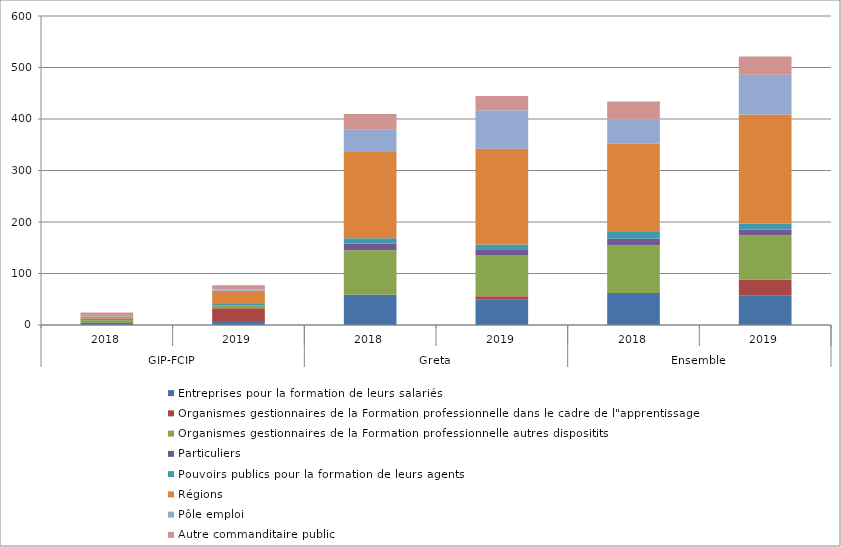
| Category | Entreprises pour la formation de leurs salariés | Organismes gestionnaires de la Formation professionnelle dans le cadre de l"apprentissage | Organismes gestionnaires de la Formation professionnelle autres dispositits | Particuliers | Pouvoirs publics pour la formation de leurs agents | Régions | Pôle emploi | Autre commanditaire public |
|---|---|---|---|---|---|---|---|---|
| 0 | 3.8 | 0 | 5.6 | 0.3 | 2.5 | 4 | 3.4 | 4.7 |
| 1 | 7.6 | 25.1 | 5.4 | 0.4 | 2.5 | 25.4 | 2.4 | 8.2 |
| 2 | 58.5 | 0 | 86.6 | 12.5 | 11 | 167.3 | 44.1 | 29.6 |
| 3 | 50.2 | 5.6 | 80.2 | 11.1 | 9.2 | 185.9 | 75 | 27.4 |
| 4 | 62.3 | 0 | 92.2 | 12.8 | 13.5 | 171.3 | 47.5 | 34.3 |
| 5 | 57.8 | 30.7 | 85.6 | 11.5 | 11.7 | 211.3 | 77.4 | 35.6 |